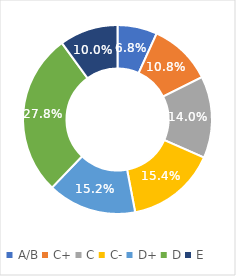
| Category | Series 0 |
|---|---|
| A/B | 0.068 |
| C+ | 0.108 |
| C | 0.14 |
| C- | 0.154 |
| D+ | 0.152 |
| D | 0.278 |
| E | 0.1 |